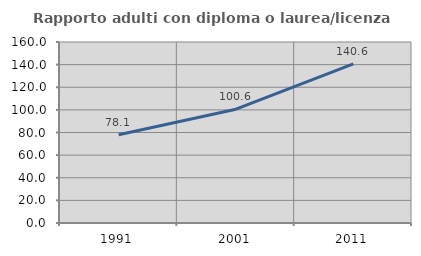
| Category | Rapporto adulti con diploma o laurea/licenza media  |
|---|---|
| 1991.0 | 78.085 |
| 2001.0 | 100.602 |
| 2011.0 | 140.597 |